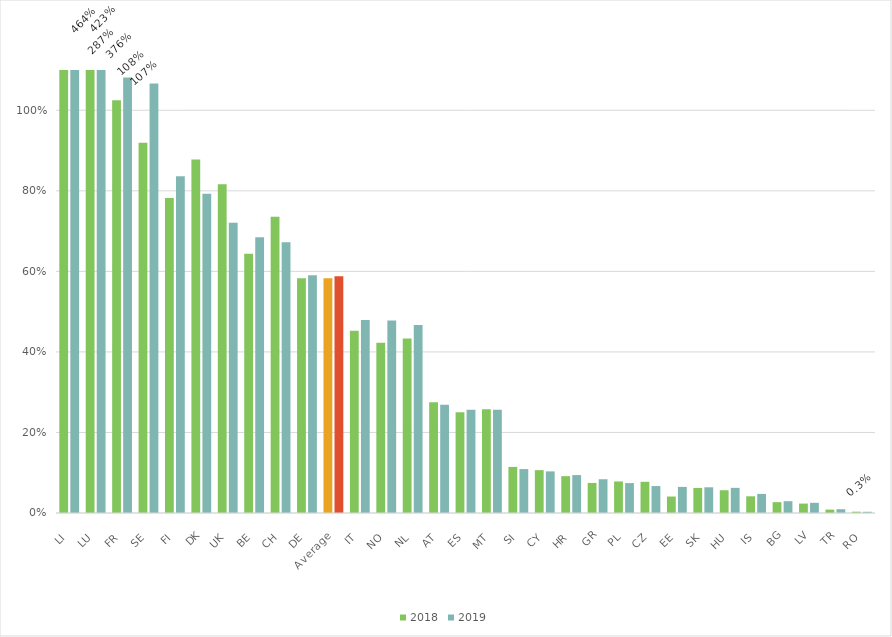
| Category | 2018 | 2019 |
|---|---|---|
| LI | 4.638 | 4.245 |
| LU | 2.873 | 3.766 |
| FR | 1.025 | 1.082 |
| SE | 0.919 | 1.066 |
| FI | 0.782 | 0.836 |
| DK | 0.878 | 0.793 |
| UK | 0.816 | 0.721 |
| BE | 0.644 | 0.685 |
| CH | 0.736 | 0.672 |
| DE | 0.583 | 0.59 |
| Average | 0.583 | 0.588 |
| IT | 0.452 | 0.479 |
| NO | 0.423 | 0.478 |
| NL | 0.433 | 0.467 |
| AT | 0.275 | 0.269 |
| ES | 0.25 | 0.256 |
| MT | 0.257 | 0.256 |
| SI | 0.114 | 0.109 |
| CY | 0.106 | 0.103 |
| HR | 0.091 | 0.094 |
| GR | 0.075 | 0.084 |
| PL | 0.078 | 0.074 |
| CZ | 0.077 | 0.067 |
| EE | 0.041 | 0.065 |
| SK | 0.062 | 0.064 |
| HU | 0.057 | 0.062 |
| IS | 0.041 | 0.047 |
| BG | 0.027 | 0.029 |
| LV | 0.023 | 0.025 |
| TR | 0.008 | 0.009 |
| RO | 0.003 | 0.003 |